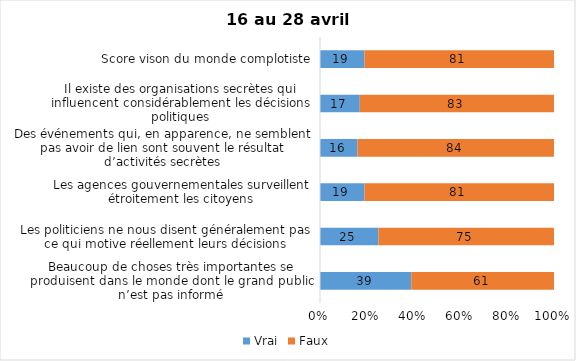
| Category | Vrai | Faux |
|---|---|---|
| Beaucoup de choses très importantes se produisent dans le monde dont le grand public n’est pas informé | 39 | 61 |
| Les politiciens ne nous disent généralement pas ce qui motive réellement leurs décisions | 25 | 75 |
| Les agences gouvernementales surveillent étroitement les citoyens | 19 | 81 |
| Des événements qui, en apparence, ne semblent pas avoir de lien sont souvent le résultat d’activités secrètes | 16 | 84 |
| Il existe des organisations secrètes qui influencent considérablement les décisions politiques | 17 | 83 |
| Score vison du monde complotiste | 19 | 81 |